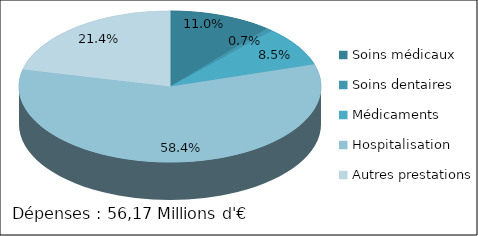
| Category | Series 0 |
|---|---|
| Soins médicaux | 697192.55 |
| Soins dentaires | 45048.92 |
| Médicaments | 536649.7 |
| Hospitalisation | 3690497.6 |
| Autres prestations | 1351405.18 |